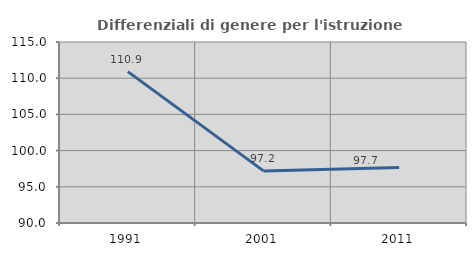
| Category | Differenziali di genere per l'istruzione superiore |
|---|---|
| 1991.0 | 110.911 |
| 2001.0 | 97.197 |
| 2011.0 | 97.677 |